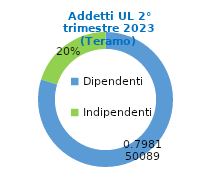
| Category | Series 0 |
|---|---|
| Dipendenti | 82235 |
| Indipendenti | 20797 |